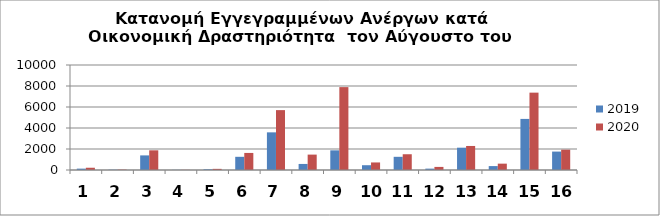
| Category | 2019 | 2020 |
|---|---|---|
| 0 | 130 | 215 |
| 1 | 28 | 38 |
| 2 | 1391 | 1874 |
| 3 | 13 | 15 |
| 4 | 70 | 109 |
| 5 | 1256 | 1625 |
| 6 | 3586 | 5703 |
| 7 | 577 | 1466 |
| 8 | 1872 | 7894 |
| 9 | 456 | 719 |
| 10 | 1256 | 1501 |
| 11 | 130 | 294 |
| 12 | 2125 | 2289 |
| 13 | 373 | 605 |
| 14 | 4866 | 7367 |
| 15 | 1754 | 1935 |